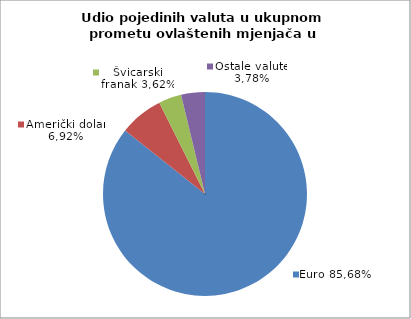
| Category | EUR |
|---|---|
| 0 | 85.684 |
| 1 | 6.922 |
| 2 | 3.617 |
| 3 | 3.777 |